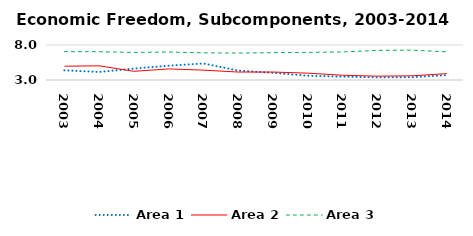
| Category | Area 1 | Area 2 | Area 3 |
|---|---|---|---|
| 2003.0 | 4.383 | 4.971 | 7.045 |
| 2004.0 | 4.143 | 5.028 | 7.038 |
| 2005.0 | 4.632 | 4.244 | 6.939 |
| 2006.0 | 5.045 | 4.582 | 6.993 |
| 2007.0 | 5.36 | 4.409 | 6.877 |
| 2008.0 | 4.347 | 4.138 | 6.848 |
| 2009.0 | 4.028 | 4.138 | 6.903 |
| 2010.0 | 3.613 | 3.979 | 6.942 |
| 2011.0 | 3.473 | 3.678 | 7.007 |
| 2012.0 | 3.382 | 3.55 | 7.222 |
| 2013.0 | 3.396 | 3.598 | 7.269 |
| 2014.0 | 3.692 | 3.907 | 7.024 |